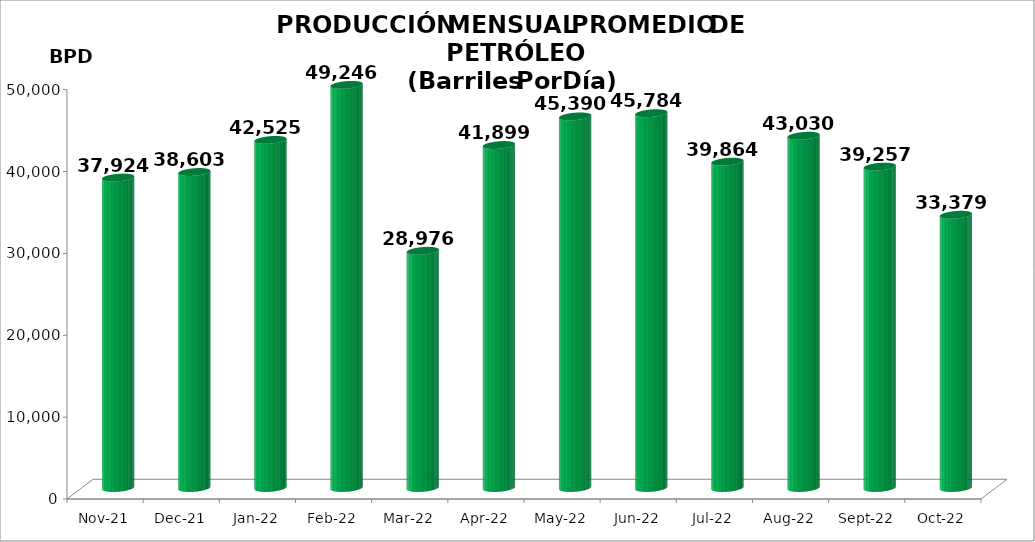
| Category | Series 0 |
|---|---|
| 2021-11-01 | 37924 |
| 2021-12-01 | 38603 |
| 2022-01-01 | 42524.516 |
| 2022-02-01 | 49246 |
| 2022-03-01 | 28976.419 |
| 2022-04-01 | 41899 |
| 2022-05-01 | 45390.387 |
| 2022-06-01 | 45784.1 |
| 2022-07-01 | 39863.677 |
| 2022-08-01 | 43030.065 |
| 2022-09-01 | 39257.333 |
| 2022-10-01 | 33379.161 |